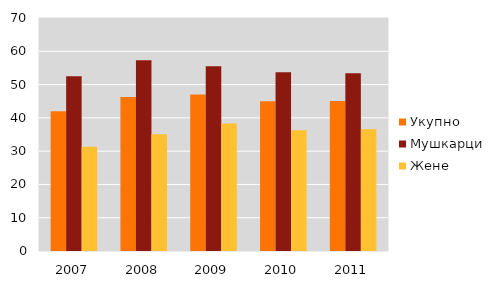
| Category | Укупно | Мушкарци | Жене |
|---|---|---|---|
| 2007.0 | 42 | 52.5 | 31.3 |
| 2008.0 | 46.3 | 57.3 | 35.1 |
| 2009.0 | 47 | 55.5 | 38.3 |
| 2010.0 | 45 | 53.7 | 36.3 |
| 2011.0 | 45.1 | 53.4 | 36.6 |